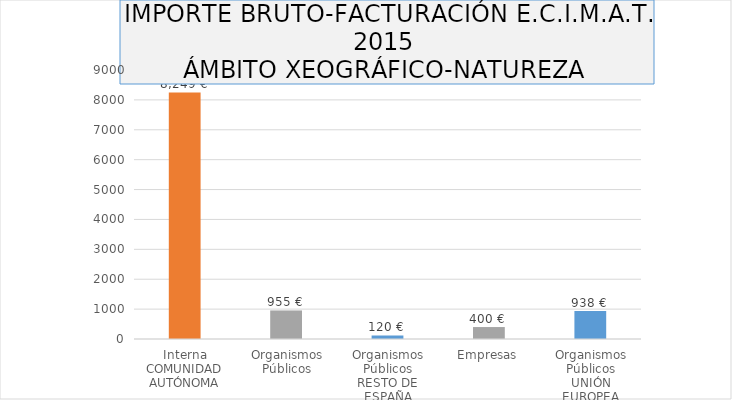
| Category | Series 0 |
|---|---|
| 0 | 8249.45 |
| 1 | 955 |
| 2 | 120 |
| 3 | 400 |
| 4 | 938 |